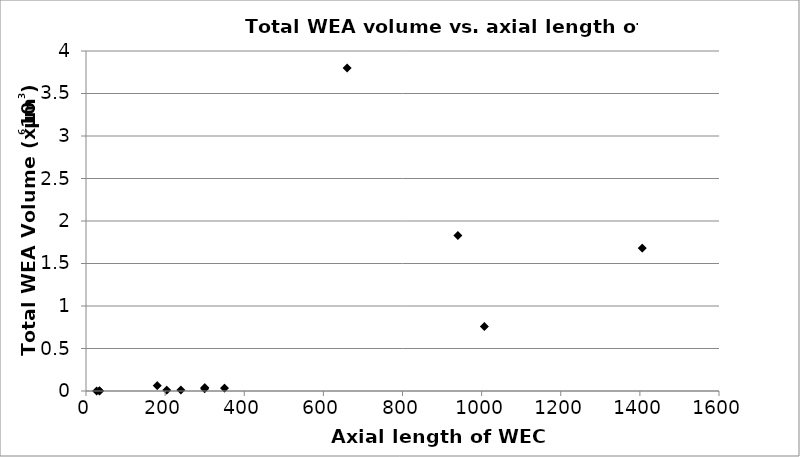
| Category | Series 0 |
|---|---|
| 1406.0 | 1.68 |
| 660.0 | 3.8 |
| 1007.0 | 0.758 |
| 940.0 | 1.83 |
| 240.0 | 0.012 |
| 300.0 | 0.039 |
| 300.0 | 0.026 |
| 180.0 | 0.062 |
| 350.0 | 0.033 |
| 204.0 | 0.011 |
| 34.0 | 0.001 |
| 34.0 | 0.001 |
| 27.0 | 0 |